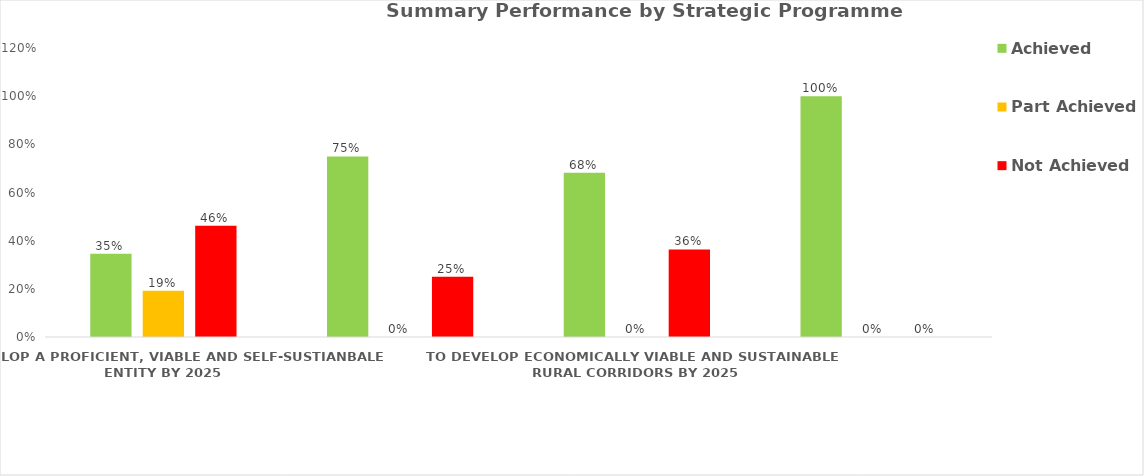
| Category | Achieved | Part Achieved | Not Achieved |
|---|---|---|---|
| TO DEVELOP A PROFICIENT, VIABLE AND SELF-SUSTIANBALE ENTITY BY 2025 | 0.346 | 0.192 | 0.462 |
| TO MOBILISE FUNDING AND FACILITATE INVESTMENT PROMOTION INTO THE DISTRICT BY 2025 | 0.75 | 0 | 0.25 |
| TO DEVELOP ECONOMICALLY VIABLE AND SUSTAINABLE RURAL CORRIDORS BY 2025 | 0.682 | 0 | 0.364 |
| TO SUPORT IMPLEMENTATION OF INFRASTRUCTURE PROJECTS IN THE DISTRICT BY 2025 | 1 | 0 | 0 |